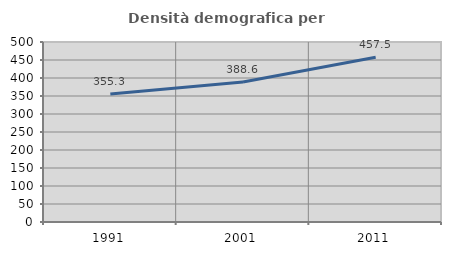
| Category | Densità demografica |
|---|---|
| 1991.0 | 355.305 |
| 2001.0 | 388.636 |
| 2011.0 | 457.475 |